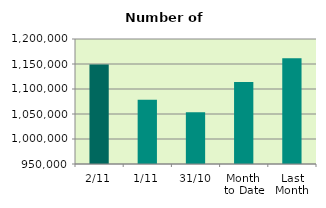
| Category | Series 0 |
|---|---|
| 2/11 | 1149194 |
| 1/11 | 1078380 |
| 31/10 | 1053594 |
| Month 
to Date | 1113787 |
| Last
Month | 1161301.714 |